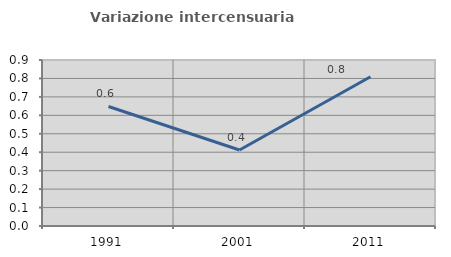
| Category | Variazione intercensuaria annua |
|---|---|
| 1991.0 | 0.648 |
| 2001.0 | 0.412 |
| 2011.0 | 0.809 |